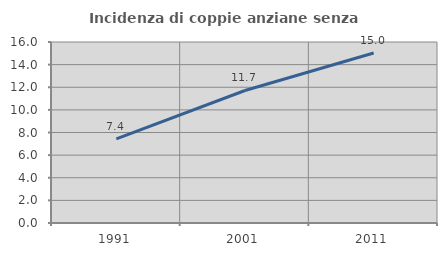
| Category | Incidenza di coppie anziane senza figli  |
|---|---|
| 1991.0 | 7.432 |
| 2001.0 | 11.714 |
| 2011.0 | 15.023 |